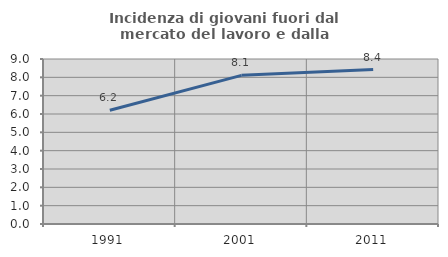
| Category | Incidenza di giovani fuori dal mercato del lavoro e dalla formazione  |
|---|---|
| 1991.0 | 6.207 |
| 2001.0 | 8.108 |
| 2011.0 | 8.421 |